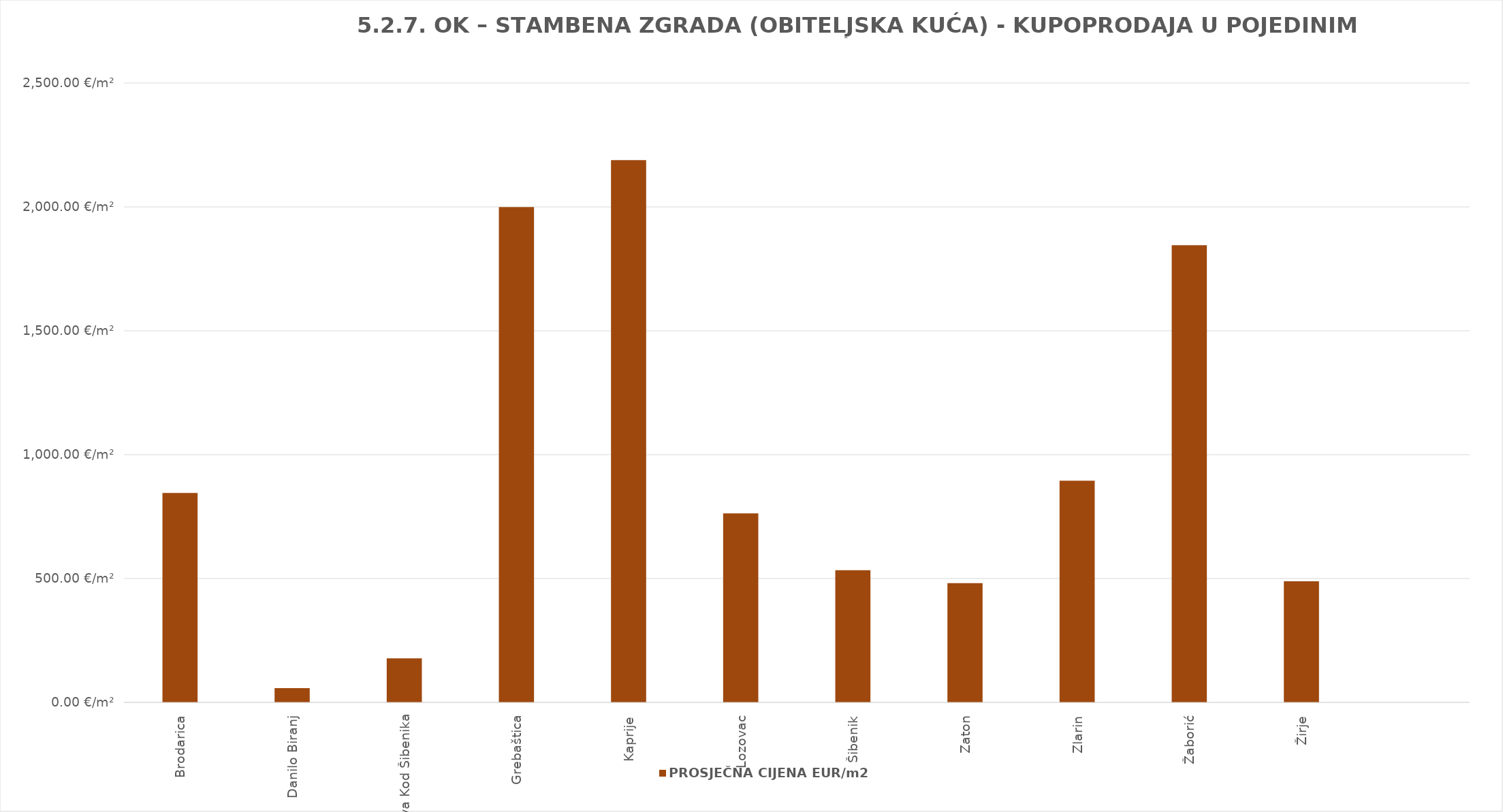
| Category | PROSJEČNA CIJENA EUR/m2 |
|---|---|
| Brodarica | 1902-04-24 12:29:10 |
| Danilo Biranj | 1900-02-26 16:37:00 |
| Dubrava Kod Šibenika | 1900-06-25 21:37:14 |
| Grebaštica | 1905-06-21 05:06:06 |
| Kaprije | 1905-12-28 00:51:49 |
| Lozovac | 1902-02-01 00:31:46 |
| Šibenik | 1901-06-16 17:56:49 |
| Zaton | 1901-04-25 05:03:13 |
| Zlarin | 1902-06-13 02:37:22 |
| Žaborić | 1905-01-18 18:03:06 |
| Žirje | 1901-05-03 05:33:39 |